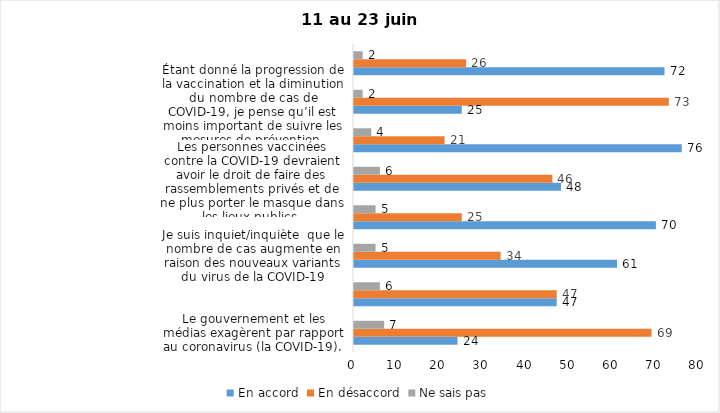
| Category | En accord | En désaccord | Ne sais pas |
|---|---|---|---|
| Le gouvernement et les médias exagèrent par rapport au coronavirus (la COVID-19). | 24 | 69 | 7 |
| J’ai peur que le système de santé soit débordé par les cas de COVID-19 suite au "déconfinement" | 47 | 47 | 6 |
| Je suis inquiet/inquiète  que le nombre de cas augmente en raison des nouveaux variants du virus de la COVID-19 | 61 | 34 | 5 |
| La frontière entre le Canada et les États-Unis devrait être fermée au moins jusqu’en septembre 2021 | 70 | 25 | 5 |
| Les personnes vaccinées contre la COVID-19 devraient avoir le droit de faire des rassemblements privés et de ne plus porter le masque dans les lieux publics. | 48 | 46 | 6 |
| Je suis favorable au passeport vaccinal qui permettrait l'accès à certains lieux ou activités aux personnes vaccinées. | 76 | 21 | 4 |
| Étant donné la progression de la vaccination et la diminution du nombre de cas de COVID-19, je pense qu’il est moins important de suivre les mesures de prévention. | 25 | 73 | 2 |
| Malgré la levée des mesures de confinement, je préfère limiter mes contacts avec d’autres personnes (par ex., en évitant les activités sociales et de groupes) | 72 | 26 | 2 |